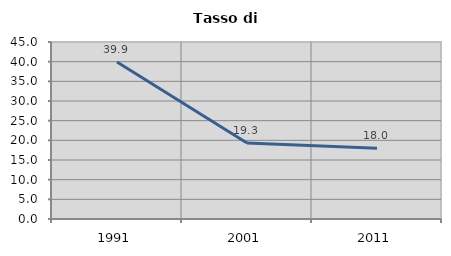
| Category | Tasso di disoccupazione   |
|---|---|
| 1991.0 | 39.895 |
| 2001.0 | 19.341 |
| 2011.0 | 17.964 |